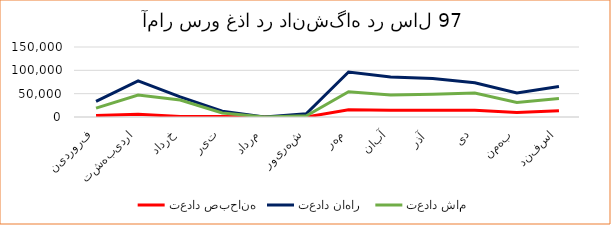
| Category | تعداد صبحانه | تعداد ناهار  | تعداد شام |
|---|---|---|---|
| فروردین | 2995 | 33363 | 18945 |
| اردیبهشت | 5849 | 77402 | 47077 |
| خرداد | 977 | 43281 | 36436 |
| تیر | 1233 | 12615 | 8728 |
| مرداد | 0 | 0 | 0 |
|  شهریور | 0 | 7139 | 2709 |
| مهر | 15652 | 96362 | 54282 |
| آبان | 14558 | 85932 | 47404 |
| آذر  | 14571 | 82415 | 48973 |
| دی | 14615 | 73482 | 51163 |
| بهمن | 9392 | 51351 | 31058 |
| اسفند | 13245 | 65507 | 39424 |